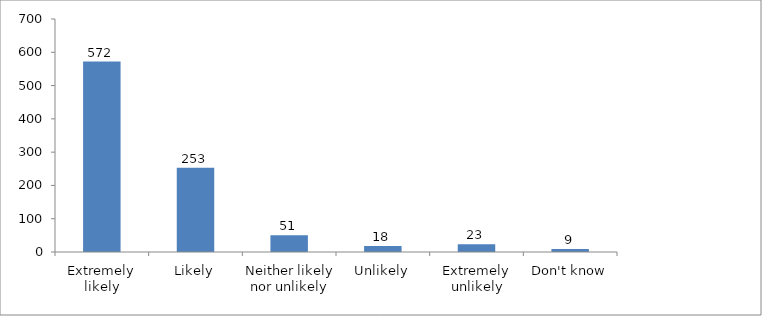
| Category | Series 0 |
|---|---|
| Extremely likely | 572 |
| Likely | 253 |
| Neither likely nor unlikely | 50 |
| Unlikely | 18 |
| Extremely unlikely | 23 |
| Don't know | 9 |